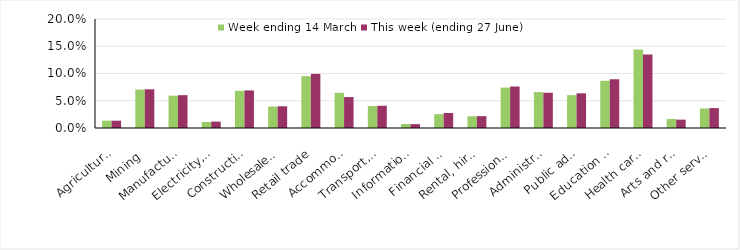
| Category | Week ending 14 March | This week (ending 27 June) |
|---|---|---|
| Agriculture, forestry and fishing | 0.013 | 0.013 |
| Mining | 0.07 | 0.071 |
| Manufacturing | 0.059 | 0.06 |
| Electricity, gas, water and waste services | 0.011 | 0.012 |
| Construction | 0.068 | 0.069 |
| Wholesale trade | 0.039 | 0.04 |
| Retail trade | 0.095 | 0.099 |
| Accommodation and food services | 0.064 | 0.057 |
| Transport, postal and warehousing | 0.04 | 0.041 |
| Information media and telecommunications | 0.007 | 0.007 |
| Financial and insurance services | 0.025 | 0.028 |
| Rental, hiring and real estate services | 0.022 | 0.022 |
| Professional, scientific and technical services | 0.074 | 0.076 |
| Administrative and support services | 0.066 | 0.065 |
| Public administration and safety | 0.06 | 0.064 |
| Education and training | 0.087 | 0.089 |
| Health care and social assistance | 0.144 | 0.135 |
| Arts and recreation services | 0.017 | 0.015 |
| Other services | 0.036 | 0.037 |